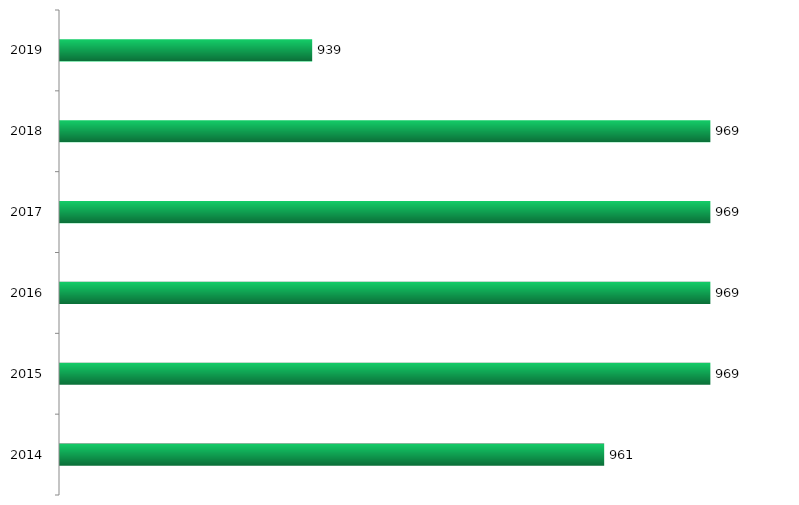
| Category | Vagas ofertadas |
|---|---|
| 2014.0 | 961 |
| 2015.0 | 969 |
| 2016.0 | 969 |
| 2017.0 | 969 |
| 2018.0 | 969 |
| 2019.0 | 939 |